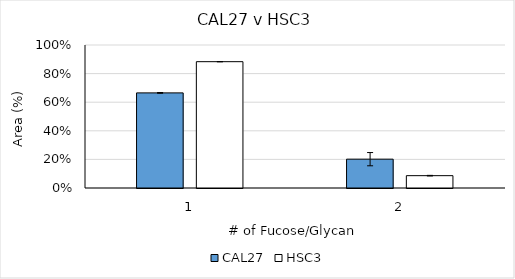
| Category | CAL27 | HSC3 |
|---|---|---|
| 0 | 0.665 | 0.883 |
| 1 | 0.202 | 0.086 |